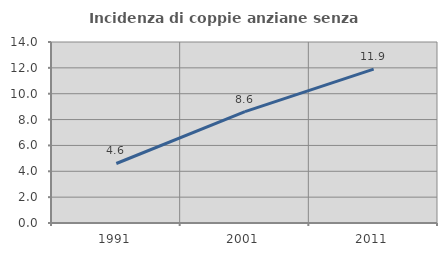
| Category | Incidenza di coppie anziane senza figli  |
|---|---|
| 1991.0 | 4.603 |
| 2001.0 | 8.612 |
| 2011.0 | 11.902 |